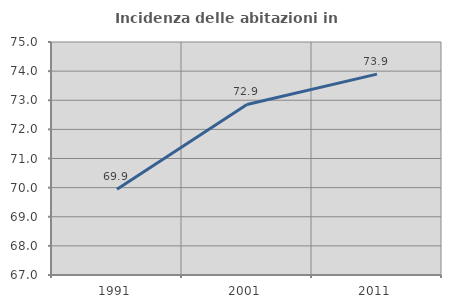
| Category | Incidenza delle abitazioni in proprietà  |
|---|---|
| 1991.0 | 69.945 |
| 2001.0 | 72.855 |
| 2011.0 | 73.898 |